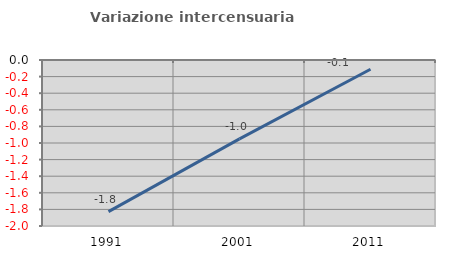
| Category | Variazione intercensuaria annua |
|---|---|
| 1991.0 | -1.827 |
| 2001.0 | -0.951 |
| 2011.0 | -0.112 |